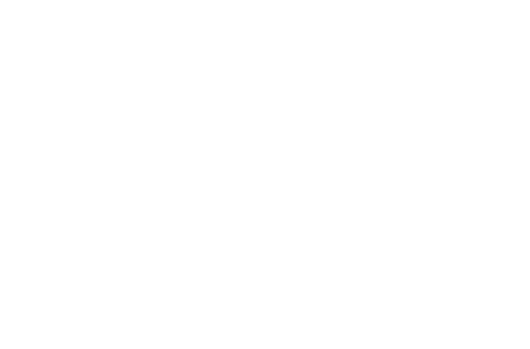
| Category | Principal Paid | Interest Paid |
|---|---|---|
| 2020 | 62.693 | 45.833 |
| 2021 | 837.802 | 573.04 |
| 2022 | 1656.633 | 1056.524 |
| 2023 | 2521.653 | 1493.819 |
| 2024 | 3435.467 | 1882.321 |
| 2025 | 4400.827 | 2219.276 |
| 2026 | 5420.641 | 2501.777 |
| 2027 | 6497.98 | 2726.753 |
| 2028 | 7636.09 | 2890.959 |
| 2029 | 8838.398 | 2990.966 |
| 2030 | 10000 | 3023.153 |